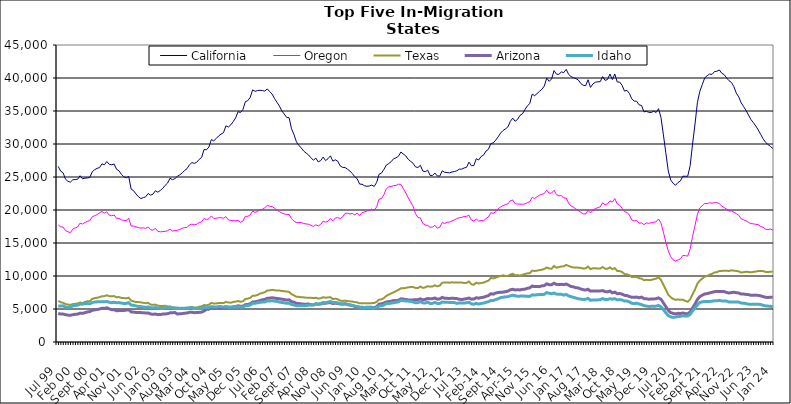
| Category |  California  |  Oregon  |  Texas  |  Arizona  |  Idaho  |
|---|---|---|---|---|---|
| Jul 99 | 26605 | 17749 | 6209 | 4339 | 5471 |
| Aug 99 | 25882 | 17447 | 6022 | 4228 | 5444 |
| Sep 99 | 25644 | 17401 | 5941 | 4237 | 5488 |
| Oct 99 | 24669 | 16875 | 5751 | 4134 | 5279 |
| Nov 99 | 24353 | 16701 | 5680 | 4073 | 5260 |
| Dec 99 | 24218 | 16570 | 5619 | 4042 | 5269 |
| Jan 00 | 24574 | 17109 | 5736 | 4142 | 5485 |
| Feb 00 | 24620 | 17295 | 5789 | 4192 | 5530 |
| Mar 00 | 24655 | 17436 | 5826 | 4226 | 5590 |
| Apr 00 | 25195 | 18009 | 5980 | 4375 | 5748 |
| May 00 | 24730 | 17875 | 5897 | 4337 | 5729 |
| Jun 00 | 24825 | 18113 | 6070 | 4444 | 5853 |
| Jul 00 | 24857 | 18294 | 6163 | 4555 | 5824 |
| Aug 00 | 24913 | 18376 | 6199 | 4603 | 5788 |
| Sep 00 | 25792 | 18971 | 6529 | 4804 | 5976 |
| Oct 00 | 26106 | 19135 | 6643 | 4870 | 6058 |
| Nov 00 | 26315 | 19306 | 6705 | 4926 | 6085 |
| Dec 00 | 26415 | 19570 | 6793 | 4991 | 6096 |
| Jan 01 | 26995 | 19781 | 6942 | 5122 | 6119 |
| Feb 01 | 26851 | 19519 | 6948 | 5089 | 6090 |
| Mar 01 | 27352 | 19720 | 7080 | 5180 | 6143 |
| Apr 01 | 26918 | 19221 | 6943 | 5020 | 6020 |
| May 01 | 26848 | 19126 | 6924 | 4899 | 5950 |
| Jun 01 | 26974 | 19241 | 6959 | 4895 | 6019 |
| Jul 01 | 26172 | 18725 | 6778 | 4737 | 5951 |
| Aug 01 | 25943 | 18736 | 6810 | 4757 | 5973 |
| Sep 01 | 25399 | 18514 | 6688 | 4753 | 5895 |
| Oct 01 | 25050 | 18415 | 6650 | 4780 | 5833 |
| Nov 01 | 24873 | 18381 | 6631 | 4826 | 5850 |
| Dec 01 | 25099 | 18765 | 6708 | 4898 | 5969 |
| Jan 02 | 23158 | 17561 | 6261 | 4560 | 5595 |
| Feb 02 | 22926 | 17573 | 6162 | 4531 | 5560 |
| Mar 02 | 22433 | 17452 | 6052 | 4481 | 5458 |
| Apr 02 | 22012 | 17314 | 6046 | 4458 | 5380 |
| May 02 | 21733 | 17267 | 6007 | 4452 | 5358 |
| Jun 02 | 21876 | 17298 | 5933 | 4444 | 5315 |
| Jul 02 | 21997 | 17209 | 5873 | 4383 | 5243 |
| Aug 02 | 22507 | 17436 | 5929 | 4407 | 5315 |
| Sep 02 | 22244 | 17010 | 5672 | 4248 | 5192 |
| Oct 02 | 22406 | 16952 | 5625 | 4191 | 5167 |
| Nov 02 | 22922 | 17223 | 5663 | 4242 | 5221 |
| Dec 02 | 22693 | 16770 | 5499 | 4142 | 5120 |
| Jan 03 | 22964 | 16694 | 5463 | 4166 | 5089 |
| Feb 03 | 23276 | 16727 | 5461 | 4226 | 5077 |
| Mar 03 | 23736 | 16766 | 5486 | 4251 | 5145 |
| Apr 03 | 24079 | 16859 | 5389 | 4289 | 5145 |
| May 03 | 24821 | 17117 | 5378 | 4415 | 5254 |
| Jun 03 | 24592 | 16812 | 5273 | 4426 | 5135 |
| Jul 03 | 24754 | 16875 | 5226 | 4466 | 5124 |
| Aug 03 | 25092 | 16922 | 5181 | 4244 | 5100 |
| Sep 03 | 25316 | 17036 | 5181 | 4279 | 5086 |
| Oct 03 | 25622 | 17228 | 5139 | 4301 | 5110 |
| Nov 03 | 25984 | 17335 | 5175 | 4362 | 5091 |
| Dec 03 | 26269 | 17350 | 5189 | 4396 | 5113 |
| Jan 04 | 26852 | 17734 | 5255 | 4492 | 5152 |
| Feb 04 | 27184 | 17860 | 5301 | 4502 | 5183 |
| Mar 04 | 27062 | 17757 | 5227 | 4443 | 5056 |
| Apr 04 | 27238 | 17840 | 5227 | 4461 | 5104 |
| May 04 | 27671 | 18113 | 5345 | 4493 | 5095 |
| Jun 04 | 27949 | 18201 | 5416 | 4532 | 5103 |
| Jul 04 | 29172 | 18727 | 5597 | 4697 | 5231 |
| Aug 04 | 29122 | 18529 | 5561 | 4945 | 5197 |
| Sep 04 | 29542 | 18678 | 5656 | 4976 | 5237 |
| Oct 04 | 30674 | 19108 | 5922 | 5188 | 5363 |
| Nov 04 | 30472 | 18716 | 5823 | 5106 | 5321 |
| Dec 04 | 30831 | 18755 | 5838 | 5135 | 5312 |
| Jan 05 | 31224 | 18823 | 5906 | 5155 | 5374 |
| Feb 05 | 31495 | 18842 | 5898 | 5168 | 5357 |
| Mar 05 | 31714 | 18738 | 5894 | 5212 | 5313 |
| Apr 05 | 32750 | 18998 | 6060 | 5340 | 5350 |
| May 05 | 32575 | 18504 | 5989 | 5269 | 5276 |
| Jun 05 | 32898 | 18414 | 5954 | 5252 | 5271 |
| Jul 05 | 33384 | 18395 | 6062 | 5322 | 5322 |
| Aug 05 | 33964 | 18381 | 6113 | 5375 | 5316 |
| Sep 05 | 34897 | 18426 | 6206 | 5493 | 5362 |
| Oct 05 | 34780 | 18132 | 6100 | 5408 | 5308 |
| Nov 05 | 35223 | 18332 | 6162 | 5434 | 5314 |
| Dec 05 | 36415 | 19047 | 6508 | 5658 | 5487 |
| Jan 06 | 36567 | 19032 | 6576 | 5688 | 5480 |
| Feb 06 | 37074 | 19257 | 6692 | 5792 | 5616 |
| Mar 06 | 38207 | 19845 | 6993 | 6052 | 5850 |
| Apr 06 | 37976 | 19637 | 7024 | 6101 | 5864 |
| May 06 | 38099 | 19781 | 7114 | 6178 | 5943 |
| Jun 06 | 38141 | 20061 | 7331 | 6276 | 6018 |
| Jul 06 | 38097 | 20111 | 7431 | 6399 | 6046 |
| Aug 06 | 38021 | 20333 | 7542 | 6450 | 6064 |
| Sep 06 | 38349 | 20686 | 7798 | 6627 | 6232 |
| Oct 06 | 37947 | 20591 | 7825 | 6647 | 6216 |
| Nov 06 | 37565 | 20526 | 7907 | 6707 | 6244 |
| Dec 06 | 36884 | 20272 | 7840 | 6648 | 6192 |
| Jan 07 | 36321 | 19984 | 7789 | 6597 | 6151 |
| Feb 07 | 35752 | 19752 | 7799 | 6554 | 6048 |
| Mar 07 | 35025 | 19547 | 7737 | 6487 | 5989 |
| Apr 07 | 34534 | 19412 | 7685 | 6430 | 5937 |
| May 07 | 34022 | 19296 | 7654 | 6353 | 5858 |
| Jun 07 | 33974 | 19318 | 7577 | 6390 | 5886 |
| Jul 07 | 32298 | 18677 | 7250 | 6117 | 5682 |
| Aug 07 | 31436 | 18322 | 7070 | 6034 | 5617 |
| Sep 07 | 30331 | 18087 | 6853 | 5847 | 5500 |
| Oct 07 | 29813 | 18108 | 6839 | 5821 | 5489 |
| Nov 07 | 29384 | 18105 | 6777 | 5769 | 5481 |
| Dec 07 | 28923 | 17949 | 6760 | 5733 | 5499 |
| Jan 08 | 28627 | 17890 | 6721 | 5732 | 5521 |
| Feb 08 | 28328 | 17834 | 6719 | 5749 | 5579 |
| Mar 08 | 27911 | 17680 | 6690 | 5650 | 5614 |
| Apr 08 | 27543 | 17512 | 6656 | 5612 | 5635 |
| May 08 | 27856 | 17754 | 6705 | 5774 | 5798 |
| Jun 08 | 27287 | 17589 | 6593 | 5717 | 5745 |
| Jul 08 | 27495 | 17834 | 6623 | 5761 | 5807 |
| Aug 08 | 28018 | 18309 | 6789 | 5867 | 5982 |
| Sep-08 | 27491 | 18164 | 6708 | 5864 | 5954 |
| Oct 08 | 27771 | 18291 | 6755 | 5942 | 6032 |
| Nov 08 | 28206 | 18706 | 6787 | 5970 | 6150 |
| Dec 08 | 27408 | 18353 | 6505 | 5832 | 5975 |
| Jan 09 | 27601 | 18778 | 6569 | 5890 | 5995 |
| Feb 09 | 27394 | 18863 | 6483 | 5845 | 5936 |
| Mar 09 | 26690 | 18694 | 6273 | 5751 | 5806 |
| Apr 09 | 26461 | 18943 | 6222 | 5735 | 5777 |
| May 09 | 26435 | 19470 | 6272 | 5819 | 5767 |
| Jun 09 | 26187 | 19522 | 6199 | 5700 | 5649 |
| Jul 09 | 25906 | 19408 | 6171 | 5603 | 5617 |
| Aug 09 | 25525 | 19469 | 6128 | 5533 | 5540 |
| Sep 09 | 25050 | 19249 | 6059 | 5405 | 5437 |
| Oct 09 | 24741 | 19529 | 6004 | 5349 | 5369 |
| Nov 09 | 23928 | 19187 | 5854 | 5271 | 5248 |
| Dec 09 | 23899 | 19607 | 5886 | 5261 | 5195 |
| Jan 10 | 23676 | 19703 | 5881 | 5232 | 5234 |
| Feb 10 | 23592 | 19845 | 5850 | 5272 | 5236 |
| Mar 10 | 23634 | 19946 | 5864 | 5278 | 5219 |
| Apr 10 | 23774 | 20134 | 5889 | 5257 | 5201 |
| May 10 | 23567 | 19966 | 5897 | 5172 | 5105 |
| Jun 10 | 24166 | 20464 | 6087 | 5356 | 5237 |
| Jul 10 | 25410 | 21627 | 6417 | 5742 | 5452 |
| Aug 10 | 25586 | 21744 | 6465 | 5797 | 5491 |
| Sep 10 | 26150 | 22314 | 6667 | 5907 | 5609 |
| Oct 10 | 26807 | 23219 | 6986 | 6070 | 5831 |
| Nov 10 | 27033 | 23520 | 7179 | 6100 | 5810 |
| Dec 10 | 27332 | 23551 | 7361 | 6182 | 5898 |
| Jan 11 | 27769 | 23697 | 7525 | 6276 | 5938 |
| Feb 11 | 27898 | 23718 | 7708 | 6267 | 6016 |
| Mar 11 | 28155 | 23921 | 7890 | 6330 | 6081 |
| Apr 11 | 28790 | 23847 | 8146 | 6544 | 6305 |
| May 11 | 28471 | 23215 | 8131 | 6502 | 6248 |
| Jun 11 | 28191 | 22580 | 8199 | 6445 | 6217 |
| Jul 11 | 27678 | 21867 | 8291 | 6368 | 6202 |
| Aug 11 | 27372 | 21203 | 8321 | 6356 | 6146 |
| Sep 11 | 27082 | 20570 | 8341 | 6387 | 6075 |
| Oct 11 | 26528 | 19442 | 8191 | 6402 | 5932 |
| Nov 11 | 26440 | 18872 | 8176 | 6426 | 5968 |
| Dec 11 | 26770 | 18784 | 8401 | 6533 | 6106 |
| Jan 12 | 25901 | 17963 | 8202 | 6390 | 5933 |
| Feb 12 | 25796 | 17718 | 8266 | 6456 | 5900 |
| Mar 12 | 26042 | 17647 | 8456 | 6600 | 6054 |
| Apr 12 | 25239 | 17386 | 8388 | 6534 | 5838 |
| May 12 | 25238 | 17407 | 8401 | 6558 | 5854 |
| Jun 12 | 25593 | 17673 | 8594 | 6669 | 6009 |
| Jul 12 | 25155 | 17237 | 8432 | 6474 | 5817 |
| Aug 12 | 25146 | 17391 | 8536 | 6539 | 5842 |
| Sep 12 | 25942 | 18102 | 8989 | 6759 | 6061 |
| Oct 12 | 25718 | 17953 | 9012 | 6618 | 6027 |
| Nov 12 | 25677 | 18134 | 9032 | 6611 | 6009 |
| Dec 12 | 25619 | 18166 | 8981 | 6601 | 5999 |
| Jan 13 | 25757 | 18344 | 9051 | 6627 | 5989 |
| Feb-13 | 25830 | 18512 | 9001 | 6606 | 5968 |
| Mar-13 | 25940 | 18689 | 9021 | 6577 | 5853 |
| Apr 13 | 26187 | 18844 | 9013 | 6478 | 5925 |
| May 13 | 26192 | 18884 | 9003 | 6431 | 5924 |
| Jun-13 | 26362 | 19013 | 8948 | 6508 | 5896 |
| Jul 13 | 26467 | 19037 | 8958 | 6559 | 5948 |
| Aug 13 | 27253 | 19198 | 9174 | 6655 | 6020 |
| Sep 13 | 26711 | 18501 | 8747 | 6489 | 5775 |
| Oct 13 | 26733 | 18301 | 8681 | 6511 | 5711 |
| Nov 13 | 27767 | 18620 | 8989 | 6709 | 5860 |
| Dec 13 | 27583 | 18320 | 8863 | 6637 | 5740 |
| Jan 14 | 28107 | 18409 | 8939 | 6735 | 5843 |
| Feb-14 | 28313 | 18383 | 8989 | 6779 | 5893 |
| Mar 14 | 28934 | 18696 | 9160 | 6918 | 6015 |
| Apr 14 | 29192 | 18946 | 9291 | 7036 | 6099 |
| May 14 | 30069 | 19603 | 9701 | 7314 | 6304 |
| Jun 14 | 30163 | 19487 | 9641 | 7252 | 6293 |
| Jul-14 | 30587 | 19754 | 9752 | 7415 | 6427 |
| Aug-14 | 31074 | 20201 | 9882 | 7499 | 6557 |
| Sep 14 | 31656 | 20459 | 9997 | 7536 | 6719 |
| Oct 14 | 32037 | 20663 | 10109 | 7555 | 6786 |
| Nov 14 | 32278 | 20825 | 9992 | 7628 | 6831 |
| Dec 14 | 32578 | 20918 | 10006 | 7705 | 6860 |
| Jan 15 | 33414 | 21396 | 10213 | 7906 | 7000 |
| Feb 15 | 33922 | 21518 | 10337 | 7982 | 7083 |
| Mar 15 | 33447 | 20942 | 10122 | 7891 | 7006 |
| Apr-15 | 33731 | 20893 | 10138 | 7906 | 6931 |
| May 15 | 34343 | 20902 | 10053 | 7895 | 6952 |
| Jun-15 | 34572 | 20870 | 10192 | 7973 | 6966 |
| Jul 15 | 35185 | 20916 | 10303 | 8000 | 6949 |
| Aug 15 | 35780 | 21115 | 10399 | 8126 | 6938 |
| Sep 15 | 36109 | 21246 | 10428 | 8207 | 6896 |
| Oct 15 | 37555 | 21908 | 10813 | 8477 | 7140 |
| Nov 15 | 37319 | 21750 | 10763 | 8390 | 7112 |
| Dec 15 | 37624 | 21990 | 10807 | 8395 | 7149 |
| Jan 16 | 37978 | 22248 | 10892 | 8388 | 7201 |
| Feb 16 | 38285 | 22369 | 10951 | 8508 | 7192 |
| Mar 16 | 38792 | 22506 | 11075 | 8547 | 7226 |
| Apr 16 | 39994 | 22999 | 11286 | 8815 | 7487 |
| May 16 | 39488 | 22548 | 11132 | 8673 | 7382 |
| Jun 16 | 39864 | 22556 | 11100 | 8682 | 7315 |
| Jul 16 | 41123 | 22989 | 11516 | 8903 | 7420 |
| Aug 16 | 40573 | 22333 | 11251 | 8731 | 7261 |
| Sep 16 | 40560 | 22162 | 11340 | 8692 | 7216 |
| Oct 16 | 40923 | 22172 | 11456 | 8742 | 7233 |
| Nov 16 | 40817 | 21818 | 11459 | 8685 | 7101 |
| Dec 16 | 41311 | 21815 | 11681 | 8783 | 7203 |
| Jan 17 | 40543 | 21029 | 11524 | 8609 | 6982 |
| Feb 17 | 40218 | 20613 | 11385 | 8416 | 6852 |
| Mar 17 | 40052 | 20425 | 11276 | 8354 | 6775 |
| Apr 17 | 39913 | 20147 | 11297 | 8218 | 6653 |
| May 17 | 39695 | 19910 | 11265 | 8196 | 6552 |
| Jun 17 | 39177 | 19650 | 11225 | 8034 | 6500 |
| Jul 17 | 38901 | 19419 | 11115 | 7923 | 6429 |
| Aug 17 | 38827 | 19389 | 11168 | 7867 | 6479 |
| Sep 17 | 39736 | 19936 | 11426 | 7991 | 6609 |
| Oct 17 | 38576 | 19547 | 11041 | 7708 | 6315 |
| Nov 17 | 39108 | 20013 | 11158 | 7746 | 6381 |
| Dec 17 | 39359 | 20202 | 11185 | 7743 | 6366 |
| Jan 18 | 39420 | 20362 | 11118 | 7736 | 6380 |
| Feb 18 | 39440 | 20476 | 11128 | 7741 | 6407 |
| Mar 18 | 40218 | 21106 | 11362 | 7789 | 6578 |
| Apr 18 | 39637 | 20788 | 11111 | 7642 | 6423 |
| May 18 | 39777 | 20933 | 11097 | 7591 | 6430 |
| Jun 18 | 40602 | 21381 | 11317 | 7721 | 6554 |
| Jul 18 | 39767 | 21189 | 11038 | 7445 | 6489 |
| Aug 18 | 40608 | 21729 | 11200 | 7560 | 6569 |
| Sep 18 | 39395 | 20916 | 10772 | 7318 | 6383 |
| Oct 18 | 39383 | 20724 | 10740 | 7344 | 6429 |
| Nov 18 | 38891 | 20265 | 10605 | 7255 | 6365 |
| Dec 18 | 38013 | 19741 | 10292 | 7069 | 6205 |
| Jan 19 | 38130 | 19643 | 10261 | 7032 | 6203 |
| Feb 19 | 37658 | 19237 | 10132 | 6892 | 6073 |
| Mar 19 | 36831 | 18492 | 9848 | 6766 | 5863 |
| Apr 19 | 36492 | 18349 | 9839 | 6763 | 5827 |
| May 19 | 36481 | 18407 | 9867 | 6809 | 5873 |
| Jun 19 | 35925 | 17998 | 9661 | 6698 | 5761 |
| Jul 19 | 35843 | 18049 | 9598 | 6800 | 5673 |
| Aug 19 | 34870 | 17785 | 9361 | 6577 | 5512 |
| Sep 19 | 34945 | 18038 | 9428 | 6547 | 5437 |
| Oct 19 | 34802 | 17977 | 9385 | 6483 | 5390 |
| Nov 19 | 34775 | 18072 | 9403 | 6511 | 5401 |
| Dec 19 | 34976 | 18140 | 9518 | 6521 | 5419 |
| Jan 20 | 34774 | 18209 | 9594 | 6561 | 5434 |
| Feb 20 | 35352 | 18632 | 9804 | 6682 | 5543 |
| Mar 20 | 34013 | 18041 | 9411 | 6464 | 5330 |
| Apr 20 | 31385 | 16629 | 8666 | 5922 | 4906 |
| May 20 | 28657 | 15123 | 7927 | 5355 | 4419 |
| Jun 20 | 25915 | 13817 | 7164 | 4815 | 3992 |
| Jul 20 | 24545 | 12926 | 6776 | 4457 | 3810 |
| Aug 20 | 24048 | 12443 | 6521 | 4326 | 3720 |
| Sep 20 | 23756 | 12258 | 6386 | 4266 | 3784 |
| Oct 20 | 24166 | 12429 | 6452 | 4347 | 3861 |
| Nov 20 | 24404 | 12597 | 6386 | 4324 | 3883 |
| Dec 20 | 25120 | 13122 | 6420 | 4394 | 3974 |
| Jan 21 | 25111 | 13080 | 6236 | 4304 | 3924 |
| Feb 21 | 25114 | 13015 | 6094 | 4260 | 3930 |
| Mar 21 | 26701 | 14096 | 6455 | 4567 | 4185 |
| Apr 21 | 29998 | 15978 | 7222 | 5164 | 4697 |
| May 21 | 33020 | 17641 | 7969 | 5748 | 5148 |
| Jun 21 | 36320 | 19369 | 8840 | 6450 | 5628 |
| Jul 21 | 37989 | 20320 | 9306 | 6877 | 5984 |
| Aug 21 | 39007 | 20657 | 9615 | 7094 | 6084 |
| Sep 21 | 40023 | 20974 | 9914 | 7277 | 6151 |
| Oct 21 | 40348 | 20966 | 10003 | 7327 | 6140 |
| Nov 21 | 40599 | 21096 | 10203 | 7437 | 6136 |
| Dec 21 | 40548 | 21032 | 10328 | 7532 | 6183 |
| Jan 22 | 40967 | 21106 | 10535 | 7618 | 6237 |
| Feb 22 | 41019 | 21125 | 10579 | 7673 | 6236 |
| Mar 22 | 41220 | 20949 | 10751 | 7660 | 6310 |
| Apr 22 | 40730 | 20602 | 10772 | 7661 | 6221 |
| May 22 | 40504 | 20370 | 10792 | 7636 | 6210 |
| Jun 22 | 40013 | 20127 | 10802 | 7504 | 6199 |
| Jul 22 | 39582 | 19846 | 10761 | 7419 | 6050 |
| Aug 22 | 39321 | 19865 | 10868 | 7487 | 6071 |
| Sep 22 | 38685 | 19666 | 10811 | 7536 | 6074 |
| Oct 22 | 37700 | 19450 | 10764 | 7469 | 6042 |
| Nov 22 | 37133 | 19198 | 10701 | 7425 | 6042 |
| Dec 22 | 36232 | 18659 | 10527 | 7261 | 5898 |
| Jan 23 | 35674 | 18528 | 10578 | 7263 | 5879 |
| Feb 23 | 35072 | 18344 | 10642 | 7211 | 5827 |
| Mar 23 | 34396 | 18133 | 10609 | 7183 | 5713 |
| Apr 23 | 33708 | 17931 | 10559 | 7074 | 5706 |
| May 23 | 33245 | 17904 | 10624 | 7091 | 5712 |
| Jun 23 | 32727 | 17831 | 10663 | 7105 | 5726 |
| Jul 23 | 32148 | 17773 | 10760 | 7058 | 5719 |
| Aug 23 | 31461 | 17513 | 10759 | 6999 | 5681 |
| Sep 23 | 30794 | 17376 | 10754 | 6882 | 5566 |
| Oct 23 | 30268 | 17096 | 10620 | 6775 | 5477 |
| Nov 23 | 29929 | 17029 | 10602 | 6746 | 5443 |
| Dec 23 | 29649 | 17114 | 10651 | 6787 | 5409 |
| Jan 24 | 29317 | 16951 | 10667 | 6765 | 5333 |